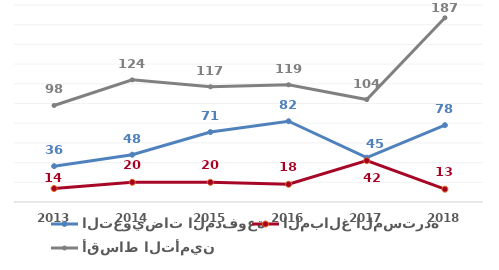
| Category | التعويضات المدفوعة | المبالغ المستردة | أقساط التأمين |
|---|---|---|---|
| 2013.0 | 36.4 | 13.7 | 98 |
| 2014.0 | 48 | 20 | 124 |
| 2015.0 | 71 | 20 | 117 |
| 2016.0 | 82 | 18 | 119 |
| 2017.0 | 45 | 42 | 104 |
| 2018.0 | 78 | 13 | 187 |